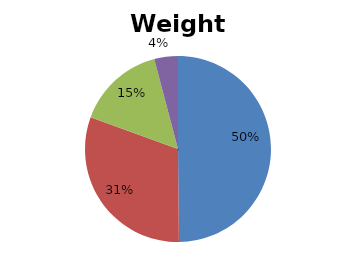
| Category | Pesos |
|---|---|
| C1 | 0.498 |
| C2 | 0.307 |
| C3 | 0.153 |
| C4 | 0.041 |